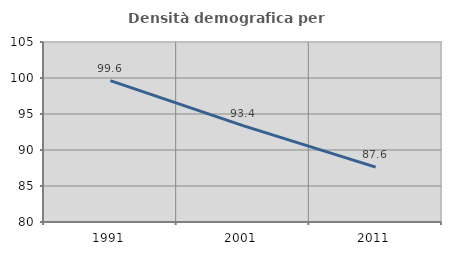
| Category | Densità demografica |
|---|---|
| 1991.0 | 99.64 |
| 2001.0 | 93.382 |
| 2011.0 | 87.613 |